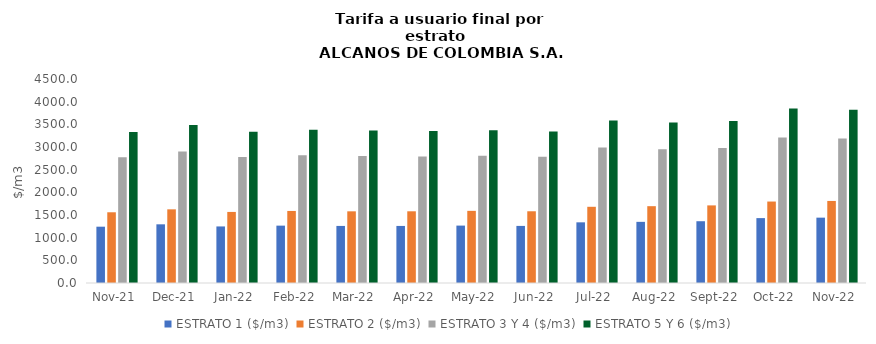
| Category | ESTRATO 1 ($/m3) | ESTRATO 2 ($/m3) | ESTRATO 3 Y 4 ($/m3) | ESTRATO 5 Y 6 ($/m3) |
|---|---|---|---|---|
| 2021-11-01 | 1242.16 | 1560.17 | 2775.81 | 3330.972 |
| 2021-12-01 | 1294.42 | 1624.99 | 2902.39 | 3482.868 |
| 2022-01-01 | 1247.63 | 1567.63 | 2778.76 | 3334.512 |
| 2022-02-01 | 1265.36 | 1589.21 | 2818.77 | 3382.524 |
| 2022-03-01 | 1258.99 | 1581.08 | 2801.57 | 3361.884 |
| 2022-04-01 | 1258.78 | 1581.81 | 2791.83 | 3350.196 |
| 2022-05-01 | 1266.29 | 1591.45 | 2808.77 | 3370.524 |
| 2022-06-01 | 1259.34 | 1582.32 | 2787.21 | 3344.652 |
| 2022-07-01 | 1338.24 | 1681.01 | 2986.65 | 3583.98 |
| 2022-08-01 | 1348.94 | 1694.58 | 2951.9 | 3542.28 |
| 2022-09-01 | 1362.74 | 1711.93 | 2979.32 | 3575.184 |
| 2022-10-01 | 1431.37 | 1796.98 | 3208.12 | 3849.744 |
| 2022-11-01 | 1441.49 | 1809.92 | 3185.9 | 3823.08 |